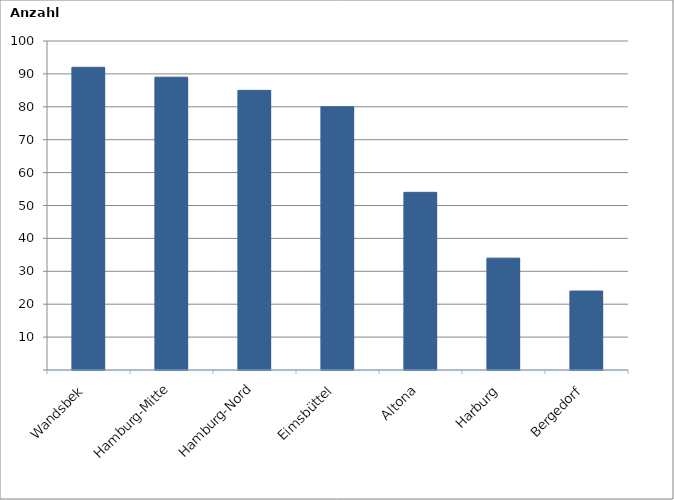
| Category | Series 0 |
|---|---|
| Wandsbek | 92 |
| Hamburg-Mitte | 89 |
| Hamburg-Nord | 85 |
| Eimsbüttel | 80 |
| Altona | 54 |
| Harburg | 34 |
| Bergedorf | 24 |